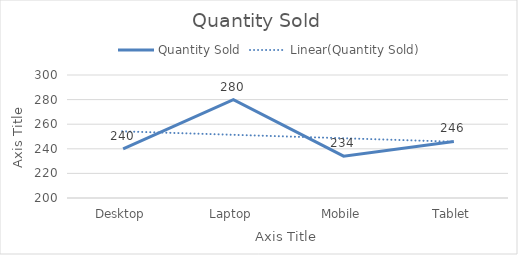
| Category | Quantity Sold |
|---|---|
| Desktop | 240 |
| Laptop | 280 |
| Mobile | 234 |
| Tablet | 246 |